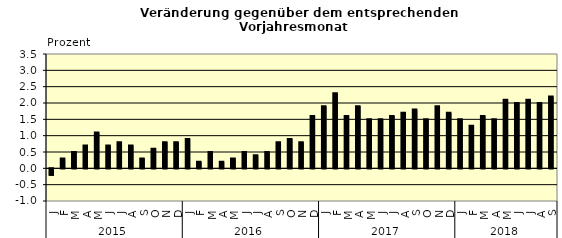
| Category | Series 0 |
|---|---|
| 0 | -0.2 |
| 1 | 0.3 |
| 2 | 0.5 |
| 3 | 0.7 |
| 4 | 1.1 |
| 5 | 0.7 |
| 6 | 0.8 |
| 7 | 0.7 |
| 8 | 0.3 |
| 9 | 0.6 |
| 10 | 0.8 |
| 11 | 0.8 |
| 12 | 0.9 |
| 13 | 0.2 |
| 14 | 0.5 |
| 15 | 0.2 |
| 16 | 0.3 |
| 17 | 0.5 |
| 18 | 0.4 |
| 19 | 0.5 |
| 20 | 0.8 |
| 21 | 0.9 |
| 22 | 0.8 |
| 23 | 1.6 |
| 24 | 1.9 |
| 25 | 2.3 |
| 26 | 1.6 |
| 27 | 1.9 |
| 28 | 1.5 |
| 29 | 1.5 |
| 30 | 1.6 |
| 31 | 1.7 |
| 32 | 1.8 |
| 33 | 1.5 |
| 34 | 1.9 |
| 35 | 1.7 |
| 36 | 1.5 |
| 37 | 1.3 |
| 38 | 1.6 |
| 39 | 1.5 |
| 40 | 2.1 |
| 41 | 2 |
| 42 | 2.1 |
| 43 | 2 |
| 44 | 2.2 |